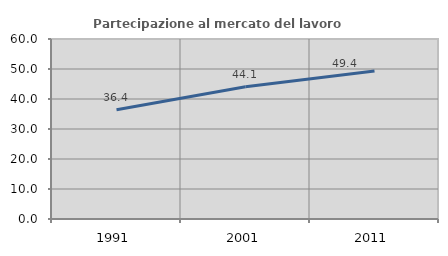
| Category | Partecipazione al mercato del lavoro  femminile |
|---|---|
| 1991.0 | 36.444 |
| 2001.0 | 44.058 |
| 2011.0 | 49.363 |